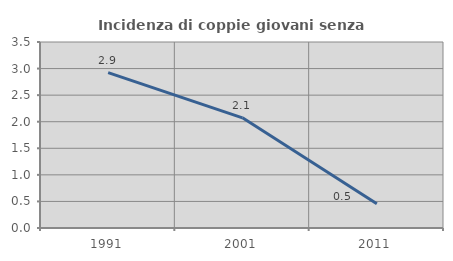
| Category | Incidenza di coppie giovani senza figli |
|---|---|
| 1991.0 | 2.925 |
| 2001.0 | 2.073 |
| 2011.0 | 0.457 |